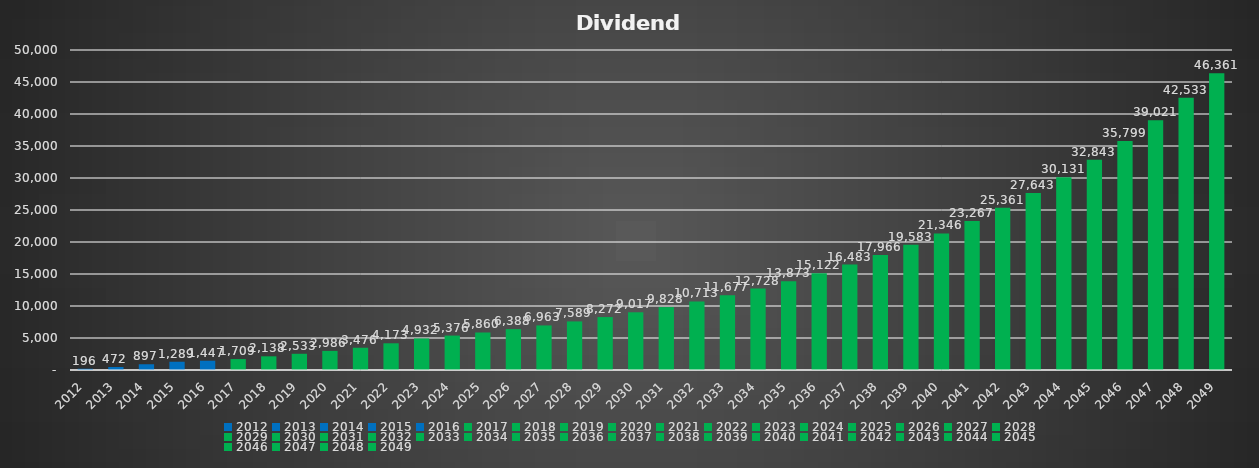
| Category | Dividends |
|---|---|
| 2012.0 | 196.11 |
| 2013.0 | 472.26 |
| 2014.0 | 897.39 |
| 2015.0 | 1289.38 |
| 2016.0 | 1447 |
| 2017.0 | 1708.599 |
| 2018.0 | 2137.849 |
| 2019.0 | 2532.986 |
| 2020.0 | 2986.125 |
| 2021.0 | 3476.02 |
| 2022.0 | 4172.861 |
| 2023.0 | 4932.419 |
| 2024.0 | 5376.337 |
| 2025.0 | 5860.207 |
| 2026.0 | 6387.626 |
| 2027.0 | 6962.512 |
| 2028.0 | 7589.138 |
| 2029.0 | 8272.161 |
| 2030.0 | 9016.655 |
| 2031.0 | 9828.154 |
| 2032.0 | 10712.688 |
| 2033.0 | 11676.83 |
| 2034.0 | 12727.744 |
| 2035.0 | 13873.241 |
| 2036.0 | 15121.833 |
| 2037.0 | 16482.798 |
| 2038.0 | 17966.25 |
| 2039.0 | 19583.212 |
| 2040.0 | 21345.701 |
| 2041.0 | 23266.815 |
| 2042.0 | 25360.828 |
| 2043.0 | 27643.302 |
| 2044.0 | 30131.2 |
| 2045.0 | 32843.007 |
| 2046.0 | 35798.878 |
| 2047.0 | 39020.777 |
| 2048.0 | 42532.647 |
| 2049.0 | 46360.585 |